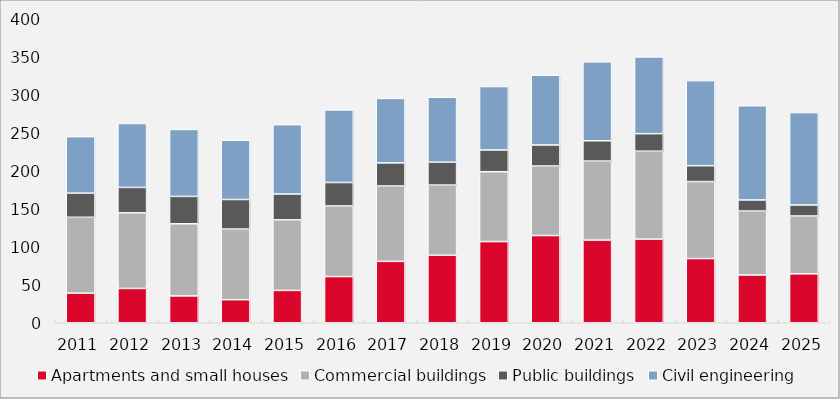
| Category | Apartments and small houses | Commercial buildings | Public buildings | Civil engineering |
|---|---|---|---|---|
| 2011.0 | 38.878 | 99.892 | 31.757 | 74.327 |
| 2012.0 | 45.158 | 99.478 | 33.441 | 84.046 |
| 2013.0 | 35.335 | 94.902 | 36.025 | 88.095 |
| 2014.0 | 30.359 | 92.921 | 38.903 | 78.077 |
| 2015.0 | 42.545 | 92.866 | 33.992 | 91.238 |
| 2016.0 | 60.811 | 92.83 | 30.909 | 95.462 |
| 2017.0 | 80.791 | 99.142 | 30.403 | 84.821 |
| 2018.0 | 88.839 | 92.344 | 30.128 | 85.41 |
| 2019.0 | 106.83 | 91.901 | 28.575 | 83.502 |
| 2020.0 | 114.78 | 91.459 | 27.681 | 91.794 |
| 2021.0 | 108.688 | 104.056 | 26.702 | 103.882 |
| 2022.0 | 110.1 | 115.64 | 23.081 | 100.955 |
| 2023.0 | 84.519 | 101.274 | 20.877 | 111.918 |
| 2024.0 | 62.923 | 84.036 | 14.614 | 123.988 |
| 2025.0 | 64.419 | 76.056 | 14.485 | 121.556 |